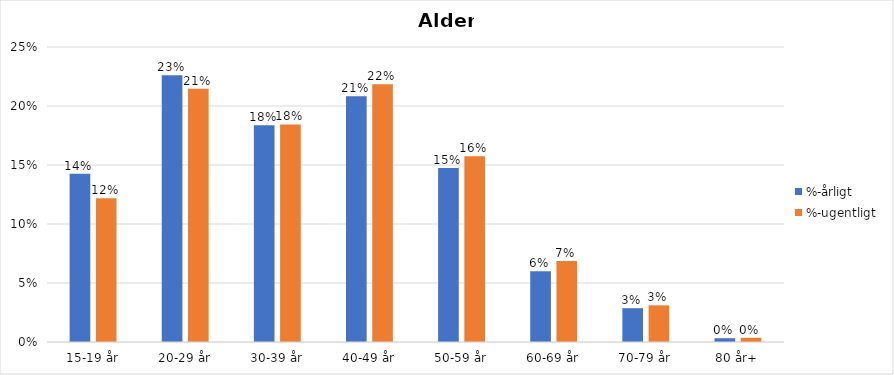
| Category | %-årligt | %-ugentligt |
|---|---|---|
| 15-19 år | 0.143 | 0.122 |
| 20-29 år | 0.226 | 0.215 |
| 30-39 år | 0.184 | 0.184 |
| 40-49 år | 0.208 | 0.218 |
| 50-59 år | 0.148 | 0.157 |
| 60-69 år | 0.06 | 0.069 |
| 70-79 år | 0.029 | 0.031 |
| 80 år+ | 0.003 | 0.004 |